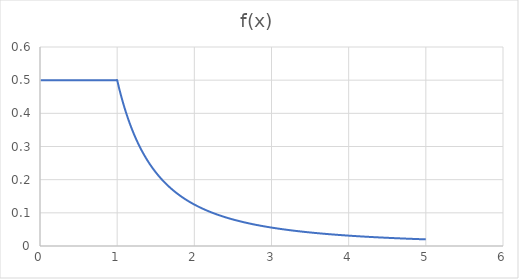
| Category | Series 0 |
|---|---|
| 0.01 | 0.5 |
| 0.02 | 0.5 |
| 0.03 | 0.5 |
| 0.04 | 0.5 |
| 0.05 | 0.5 |
| 0.06 | 0.5 |
| 0.07 | 0.5 |
| 0.08 | 0.5 |
| 0.09 | 0.5 |
| 0.1 | 0.5 |
| 0.11 | 0.5 |
| 0.12 | 0.5 |
| 0.13 | 0.5 |
| 0.14 | 0.5 |
| 0.15 | 0.5 |
| 0.16 | 0.5 |
| 0.17 | 0.5 |
| 0.18 | 0.5 |
| 0.19 | 0.5 |
| 0.2 | 0.5 |
| 0.21 | 0.5 |
| 0.22 | 0.5 |
| 0.23 | 0.5 |
| 0.24 | 0.5 |
| 0.25 | 0.5 |
| 0.26 | 0.5 |
| 0.27 | 0.5 |
| 0.28 | 0.5 |
| 0.29 | 0.5 |
| 0.3 | 0.5 |
| 0.31 | 0.5 |
| 0.32 | 0.5 |
| 0.33 | 0.5 |
| 0.34 | 0.5 |
| 0.35 | 0.5 |
| 0.36 | 0.5 |
| 0.37 | 0.5 |
| 0.38 | 0.5 |
| 0.39 | 0.5 |
| 0.4 | 0.5 |
| 0.41 | 0.5 |
| 0.42 | 0.5 |
| 0.43 | 0.5 |
| 0.44 | 0.5 |
| 0.45 | 0.5 |
| 0.46 | 0.5 |
| 0.47 | 0.5 |
| 0.48 | 0.5 |
| 0.49 | 0.5 |
| 0.5 | 0.5 |
| 0.51 | 0.5 |
| 0.52 | 0.5 |
| 0.53 | 0.5 |
| 0.54 | 0.5 |
| 0.55 | 0.5 |
| 0.56 | 0.5 |
| 0.57 | 0.5 |
| 0.58 | 0.5 |
| 0.59 | 0.5 |
| 0.6 | 0.5 |
| 0.61 | 0.5 |
| 0.62 | 0.5 |
| 0.63 | 0.5 |
| 0.64 | 0.5 |
| 0.65 | 0.5 |
| 0.66 | 0.5 |
| 0.67 | 0.5 |
| 0.68 | 0.5 |
| 0.69 | 0.5 |
| 0.7 | 0.5 |
| 0.71 | 0.5 |
| 0.72 | 0.5 |
| 0.73 | 0.5 |
| 0.74 | 0.5 |
| 0.75 | 0.5 |
| 0.76 | 0.5 |
| 0.77 | 0.5 |
| 0.78 | 0.5 |
| 0.79 | 0.5 |
| 0.8 | 0.5 |
| 0.81 | 0.5 |
| 0.82 | 0.5 |
| 0.83 | 0.5 |
| 0.84 | 0.5 |
| 0.85 | 0.5 |
| 0.86 | 0.5 |
| 0.87 | 0.5 |
| 0.88 | 0.5 |
| 0.89 | 0.5 |
| 0.9 | 0.5 |
| 0.91 | 0.5 |
| 0.92 | 0.5 |
| 0.93 | 0.5 |
| 0.94 | 0.5 |
| 0.95 | 0.5 |
| 0.96 | 0.5 |
| 0.97 | 0.5 |
| 0.98 | 0.5 |
| 0.99 | 0.5 |
| 1.0 | 0.5 |
| 1.01 | 0.49 |
| 1.02 | 0.481 |
| 1.03 | 0.471 |
| 1.04 | 0.462 |
| 1.05 | 0.454 |
| 1.06 | 0.445 |
| 1.07 | 0.437 |
| 1.08 | 0.429 |
| 1.09 | 0.421 |
| 1.1 | 0.413 |
| 1.11 | 0.406 |
| 1.12 | 0.399 |
| 1.13 | 0.392 |
| 1.14 | 0.385 |
| 1.15 | 0.378 |
| 1.16 | 0.372 |
| 1.17 | 0.365 |
| 1.18 | 0.359 |
| 1.19 | 0.353 |
| 1.2 | 0.347 |
| 1.21 | 0.342 |
| 1.22 | 0.336 |
| 1.23 | 0.33 |
| 1.24 | 0.325 |
| 1.25 | 0.32 |
| 1.26 | 0.315 |
| 1.27 | 0.31 |
| 1.28 | 0.305 |
| 1.29 | 0.3 |
| 1.3 | 0.296 |
| 1.31 | 0.291 |
| 1.32 | 0.287 |
| 1.33 | 0.283 |
| 1.34 | 0.278 |
| 1.35 | 0.274 |
| 1.36 | 0.27 |
| 1.37 | 0.266 |
| 1.38 | 0.263 |
| 1.39 | 0.259 |
| 1.4 | 0.255 |
| 1.41 | 0.251 |
| 1.42 | 0.248 |
| 1.43 | 0.245 |
| 1.44 | 0.241 |
| 1.45 | 0.238 |
| 1.46 | 0.235 |
| 1.47 | 0.231 |
| 1.48 | 0.228 |
| 1.49 | 0.225 |
| 1.5 | 0.222 |
| 1.51 | 0.219 |
| 1.52 | 0.216 |
| 1.53 | 0.214 |
| 1.54 | 0.211 |
| 1.55 | 0.208 |
| 1.56 | 0.205 |
| 1.57 | 0.203 |
| 1.58 | 0.2 |
| 1.59 | 0.198 |
| 1.6 | 0.195 |
| 1.61 | 0.193 |
| 1.62 | 0.191 |
| 1.63 | 0.188 |
| 1.64 | 0.186 |
| 1.65 | 0.184 |
| 1.66 | 0.181 |
| 1.67 | 0.179 |
| 1.68 | 0.177 |
| 1.69 | 0.175 |
| 1.7 | 0.173 |
| 1.71 | 0.171 |
| 1.72 | 0.169 |
| 1.73 | 0.167 |
| 1.74 | 0.165 |
| 1.75 | 0.163 |
| 1.76 | 0.161 |
| 1.77 | 0.16 |
| 1.78 | 0.158 |
| 1.79 | 0.156 |
| 1.8 | 0.154 |
| 1.81 | 0.153 |
| 1.82 | 0.151 |
| 1.83 | 0.149 |
| 1.84 | 0.148 |
| 1.85 | 0.146 |
| 1.86 | 0.145 |
| 1.87 | 0.143 |
| 1.88 | 0.141 |
| 1.89 | 0.14 |
| 1.9 | 0.139 |
| 1.91 | 0.137 |
| 1.92 | 0.136 |
| 1.93 | 0.134 |
| 1.94 | 0.133 |
| 1.95 | 0.131 |
| 1.96 | 0.13 |
| 1.97 | 0.129 |
| 1.98 | 0.128 |
| 1.99 | 0.126 |
| 2.0 | 0.125 |
| 2.01 | 0.124 |
| 2.02 | 0.123 |
| 2.03 | 0.121 |
| 2.04 | 0.12 |
| 2.05 | 0.119 |
| 2.06 | 0.118 |
| 2.07 | 0.117 |
| 2.08 | 0.116 |
| 2.09 | 0.114 |
| 2.1 | 0.113 |
| 2.11 | 0.112 |
| 2.12 | 0.111 |
| 2.13 | 0.11 |
| 2.14 | 0.109 |
| 2.15 | 0.108 |
| 2.16 | 0.107 |
| 2.17 | 0.106 |
| 2.18 | 0.105 |
| 2.19 | 0.104 |
| 2.2 | 0.103 |
| 2.21 | 0.102 |
| 2.22 | 0.101 |
| 2.23 | 0.101 |
| 2.24 | 0.1 |
| 2.25 | 0.099 |
| 2.26 | 0.098 |
| 2.27 | 0.097 |
| 2.28 | 0.096 |
| 2.29 | 0.095 |
| 2.3 | 0.095 |
| 2.31 | 0.094 |
| 2.32 | 0.093 |
| 2.33 | 0.092 |
| 2.34 | 0.091 |
| 2.35 | 0.091 |
| 2.36 | 0.09 |
| 2.37 | 0.089 |
| 2.38 | 0.088 |
| 2.39 | 0.088 |
| 2.4 | 0.087 |
| 2.41 | 0.086 |
| 2.42 | 0.085 |
| 2.43 | 0.085 |
| 2.44 | 0.084 |
| 2.45 | 0.083 |
| 2.46 | 0.083 |
| 2.47 | 0.082 |
| 2.48 | 0.081 |
| 2.49 | 0.081 |
| 2.5 | 0.08 |
| 2.51 | 0.079 |
| 2.52 | 0.079 |
| 2.53 | 0.078 |
| 2.54 | 0.078 |
| 2.55 | 0.077 |
| 2.56 | 0.076 |
| 2.57 | 0.076 |
| 2.58 | 0.075 |
| 2.59 | 0.075 |
| 2.6 | 0.074 |
| 2.61 | 0.073 |
| 2.62 | 0.073 |
| 2.63 | 0.072 |
| 2.64 | 0.072 |
| 2.65 | 0.071 |
| 2.66 | 0.071 |
| 2.67 | 0.07 |
| 2.68 | 0.07 |
| 2.69 | 0.069 |
| 2.7 | 0.069 |
| 2.71 | 0.068 |
| 2.72 | 0.068 |
| 2.73 | 0.067 |
| 2.74 | 0.067 |
| 2.75 | 0.066 |
| 2.76 | 0.066 |
| 2.77 | 0.065 |
| 2.78 | 0.065 |
| 2.79 | 0.064 |
| 2.8 | 0.064 |
| 2.81 | 0.063 |
| 2.82 | 0.063 |
| 2.83 | 0.062 |
| 2.84 | 0.062 |
| 2.85 | 0.062 |
| 2.86 | 0.061 |
| 2.87 | 0.061 |
| 2.88 | 0.06 |
| 2.89 | 0.06 |
| 2.9 | 0.059 |
| 2.91 | 0.059 |
| 2.92 | 0.059 |
| 2.93 | 0.058 |
| 2.94 | 0.058 |
| 2.95 | 0.057 |
| 2.96 | 0.057 |
| 2.97 | 0.057 |
| 2.98 | 0.056 |
| 2.99 | 0.056 |
| 3.0 | 0.056 |
| 3.01 | 0.055 |
| 3.02 | 0.055 |
| 3.03 | 0.054 |
| 3.04 | 0.054 |
| 3.05 | 0.054 |
| 3.06 | 0.053 |
| 3.07 | 0.053 |
| 3.08 | 0.053 |
| 3.09 | 0.052 |
| 3.1 | 0.052 |
| 3.11 | 0.052 |
| 3.12 | 0.051 |
| 3.13 | 0.051 |
| 3.14 | 0.051 |
| 3.15 | 0.05 |
| 3.16 | 0.05 |
| 3.17 | 0.05 |
| 3.18 | 0.049 |
| 3.19 | 0.049 |
| 3.2 | 0.049 |
| 3.21 | 0.049 |
| 3.22 | 0.048 |
| 3.23 | 0.048 |
| 3.24 | 0.048 |
| 3.25 | 0.047 |
| 3.26 | 0.047 |
| 3.27 | 0.047 |
| 3.28 | 0.046 |
| 3.29 | 0.046 |
| 3.3 | 0.046 |
| 3.31 | 0.046 |
| 3.32 | 0.045 |
| 3.33 | 0.045 |
| 3.34 | 0.045 |
| 3.35 | 0.045 |
| 3.36 | 0.044 |
| 3.37 | 0.044 |
| 3.38 | 0.044 |
| 3.39 | 0.044 |
| 3.4 | 0.043 |
| 3.41 | 0.043 |
| 3.42 | 0.043 |
| 3.43 | 0.042 |
| 3.44 | 0.042 |
| 3.45 | 0.042 |
| 3.46 | 0.042 |
| 3.47 | 0.042 |
| 3.48 | 0.041 |
| 3.49 | 0.041 |
| 3.5 | 0.041 |
| 3.51 | 0.041 |
| 3.52 | 0.04 |
| 3.53 | 0.04 |
| 3.54 | 0.04 |
| 3.55 | 0.04 |
| 3.56 | 0.039 |
| 3.57 | 0.039 |
| 3.58 | 0.039 |
| 3.59 | 0.039 |
| 3.6 | 0.039 |
| 3.61 | 0.038 |
| 3.62 | 0.038 |
| 3.63 | 0.038 |
| 3.64 | 0.038 |
| 3.65 | 0.038 |
| 3.66 | 0.037 |
| 3.67 | 0.037 |
| 3.68 | 0.037 |
| 3.69 | 0.037 |
| 3.7 | 0.037 |
| 3.71 | 0.036 |
| 3.72 | 0.036 |
| 3.73 | 0.036 |
| 3.74 | 0.036 |
| 3.75 | 0.036 |
| 3.76 | 0.035 |
| 3.77 | 0.035 |
| 3.78 | 0.035 |
| 3.79 | 0.035 |
| 3.8 | 0.035 |
| 3.81 | 0.034 |
| 3.82 | 0.034 |
| 3.83 | 0.034 |
| 3.84 | 0.034 |
| 3.85 | 0.034 |
| 3.86 | 0.034 |
| 3.87 | 0.033 |
| 3.88 | 0.033 |
| 3.89 | 0.033 |
| 3.9 | 0.033 |
| 3.91 | 0.033 |
| 3.92 | 0.033 |
| 3.93 | 0.032 |
| 3.94 | 0.032 |
| 3.95 | 0.032 |
| 3.96 | 0.032 |
| 3.97 | 0.032 |
| 3.98 | 0.032 |
| 3.99 | 0.031 |
| 4.0 | 0.031 |
| 4.01 | 0.031 |
| 4.02 | 0.031 |
| 4.03 | 0.031 |
| 4.04 | 0.031 |
| 4.05 | 0.03 |
| 4.06 | 0.03 |
| 4.07 | 0.03 |
| 4.08 | 0.03 |
| 4.09 | 0.03 |
| 4.1 | 0.03 |
| 4.11 | 0.03 |
| 4.12 | 0.029 |
| 4.13 | 0.029 |
| 4.14 | 0.029 |
| 4.15 | 0.029 |
| 4.16 | 0.029 |
| 4.17 | 0.029 |
| 4.18 | 0.029 |
| 4.19 | 0.028 |
| 4.2 | 0.028 |
| 4.21 | 0.028 |
| 4.22 | 0.028 |
| 4.23 | 0.028 |
| 4.24 | 0.028 |
| 4.25 | 0.028 |
| 4.26 | 0.028 |
| 4.27 | 0.027 |
| 4.28 | 0.027 |
| 4.29 | 0.027 |
| 4.3 | 0.027 |
| 4.31 | 0.027 |
| 4.32 | 0.027 |
| 4.33 | 0.027 |
| 4.34 | 0.027 |
| 4.35 | 0.026 |
| 4.36 | 0.026 |
| 4.37 | 0.026 |
| 4.38 | 0.026 |
| 4.39 | 0.026 |
| 4.4 | 0.026 |
| 4.41 | 0.026 |
| 4.42 | 0.026 |
| 4.43 | 0.025 |
| 4.44 | 0.025 |
| 4.45 | 0.025 |
| 4.46 | 0.025 |
| 4.47 | 0.025 |
| 4.48 | 0.025 |
| 4.49 | 0.025 |
| 4.5 | 0.025 |
| 4.51 | 0.025 |
| 4.52 | 0.024 |
| 4.53 | 0.024 |
| 4.54 | 0.024 |
| 4.55 | 0.024 |
| 4.56 | 0.024 |
| 4.57 | 0.024 |
| 4.58 | 0.024 |
| 4.59 | 0.024 |
| 4.6 | 0.024 |
| 4.61 | 0.024 |
| 4.62 | 0.023 |
| 4.63 | 0.023 |
| 4.64 | 0.023 |
| 4.65 | 0.023 |
| 4.66 | 0.023 |
| 4.67 | 0.023 |
| 4.68 | 0.023 |
| 4.69 | 0.023 |
| 4.7 | 0.023 |
| 4.71 | 0.023 |
| 4.72 | 0.022 |
| 4.73 | 0.022 |
| 4.74 | 0.022 |
| 4.75 | 0.022 |
| 4.76 | 0.022 |
| 4.77 | 0.022 |
| 4.78 | 0.022 |
| 4.79 | 0.022 |
| 4.8 | 0.022 |
| 4.81 | 0.022 |
| 4.82 | 0.022 |
| 4.83 | 0.021 |
| 4.84 | 0.021 |
| 4.85 | 0.021 |
| 4.86 | 0.021 |
| 4.87 | 0.021 |
| 4.88 | 0.021 |
| 4.89 | 0.021 |
| 4.9 | 0.021 |
| 4.91 | 0.021 |
| 4.92 | 0.021 |
| 4.93 | 0.021 |
| 4.94 | 0.02 |
| 4.95 | 0.02 |
| 4.96 | 0.02 |
| 4.97 | 0.02 |
| 4.98 | 0.02 |
| 4.99 | 0.02 |
| 5.0 | 0.02 |